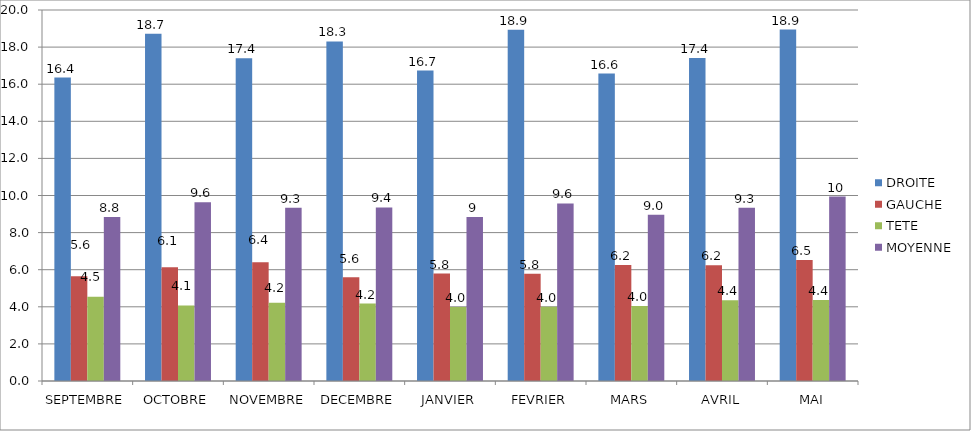
| Category | DROITE | GAUCHE | TETE | MOYENNE |
|---|---|---|---|---|
| SEPTEMBRE | 16.36 | 5.64 | 4.54 | 8.847 |
| OCTOBRE | 18.726 | 6.126 | 4.074 | 9.642 |
| NOVEMBRE | 17.406 | 6.399 | 4.217 | 9.34 |
| DECEMBRE | 18.304 | 5.598 | 4.176 | 9.359 |
| JANVIER | 16.738 | 5.794 | 3.993 | 8.842 |
| FEVRIER | 18.937 | 5.779 | 4 | 9.572 |
| MARS | 16.571 | 6.248 | 4.048 | 8.956 |
| AVRIL | 17.412 | 6.237 | 4.351 | 9.333 |
| MAI | 18.942 | 6.529 | 4.365 | 9.946 |